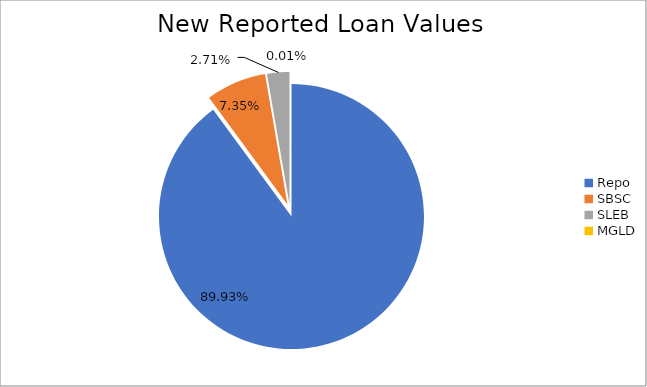
| Category | Series 0 |
|---|---|
| Repo | 12481350.937 |
| SBSC | 1019504.924 |
| SLEB | 376396.005 |
| MGLD | 1241.529 |